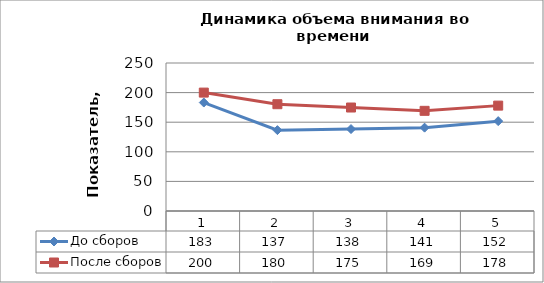
| Category | До сборов | После сборов |
|---|---|---|
| 0 | 183.2 | 200 |
| 1 | 136.6 | 180.4 |
| 2 | 138.4 | 174.8 |
| 3 | 140.8 | 169.2 |
| 4 | 151.8 | 178 |